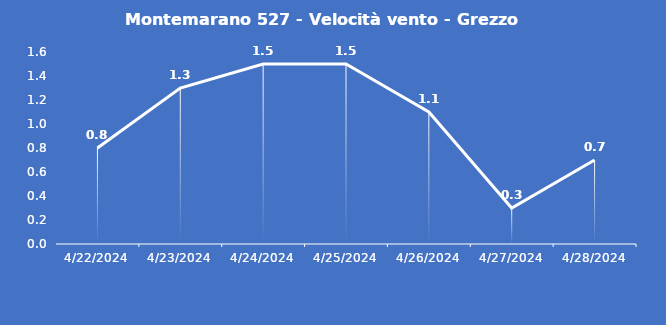
| Category | Montemarano 527 - Velocità vento - Grezzo (m/s) |
|---|---|
| 4/22/24 | 0.8 |
| 4/23/24 | 1.3 |
| 4/24/24 | 1.5 |
| 4/25/24 | 1.5 |
| 4/26/24 | 1.1 |
| 4/27/24 | 0.3 |
| 4/28/24 | 0.7 |